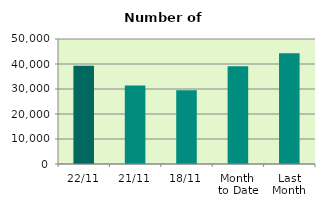
| Category | Series 0 |
|---|---|
| 22/11 | 39300 |
| 21/11 | 31390 |
| 18/11 | 29454 |
| Month 
to Date | 39093.25 |
| Last
Month | 44266.476 |